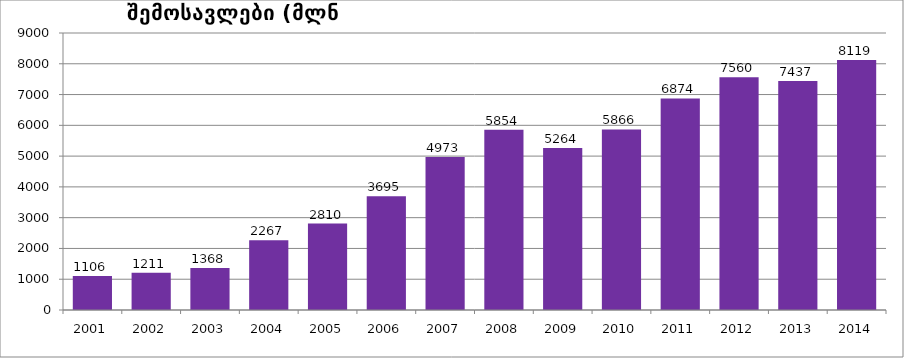
| Category | შემოსავლები (მლნ ლარებში) |
|---|---|
| 2001.0 | 1105.679 |
| 2002.0 | 1211.017 |
| 2003.0 | 1367.813 |
| 2004.0 | 2266.625 |
| 2005.0 | 2810.25 |
| 2006.0 | 3694.684 |
| 2007.0 | 4972.635 |
| 2008.0 | 5854.175 |
| 2009.0 | 5264.495 |
| 2010.0 | 5865.801 |
| 2011.0 | 6873.661 |
| 2012.0 | 7560.046 |
| 2013.0 | 7437.173 |
| 2014.0 | 8118.8 |